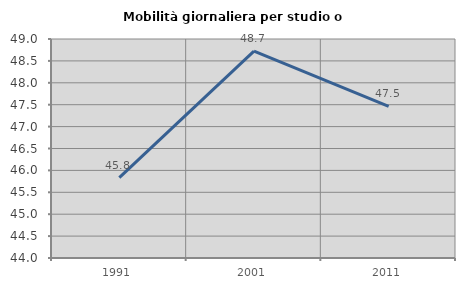
| Category | Mobilità giornaliera per studio o lavoro |
|---|---|
| 1991.0 | 45.833 |
| 2001.0 | 48.725 |
| 2011.0 | 47.46 |